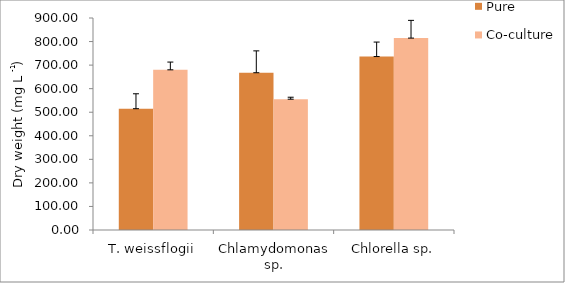
| Category | Pure | Co-culture |
|---|---|---|
| T. weissflogii | 515 | 680 |
| Chlamydomonas sp. | 667.667 | 555.333 |
| Chlorella sp. | 736.333 | 814.667 |